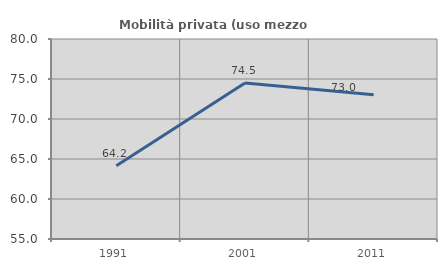
| Category | Mobilità privata (uso mezzo privato) |
|---|---|
| 1991.0 | 64.167 |
| 2001.0 | 74.503 |
| 2011.0 | 73.024 |